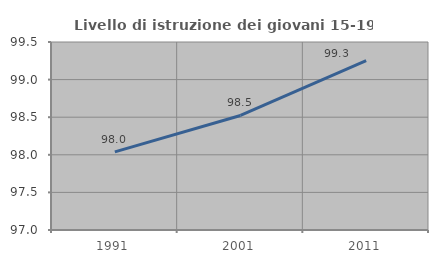
| Category | Livello di istruzione dei giovani 15-19 anni |
|---|---|
| 1991.0 | 98.039 |
| 2001.0 | 98.523 |
| 2011.0 | 99.251 |